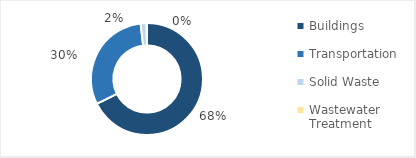
| Category | Series 0 |
|---|---|
| Buildings | 1428695.876 |
| Transportation | 642823.179 |
| Solid Waste | 37622.91 |
| Wastewater Treatment | 1019.453 |